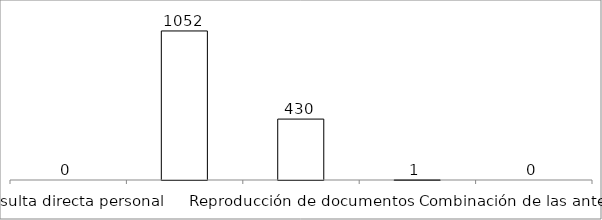
| Category | Series 0 |
|---|---|
| Consulta directa personal | 0 |
| Consulta directa electrónica | 1052 |
| Reproducción de documentos | 430 |
| Elaboración de informes | 1 |
| Combinación de las anteriores | 0 |